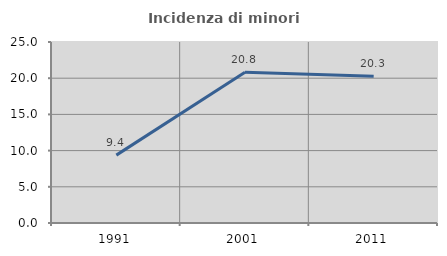
| Category | Incidenza di minori stranieri |
|---|---|
| 1991.0 | 9.375 |
| 2001.0 | 20.816 |
| 2011.0 | 20.255 |